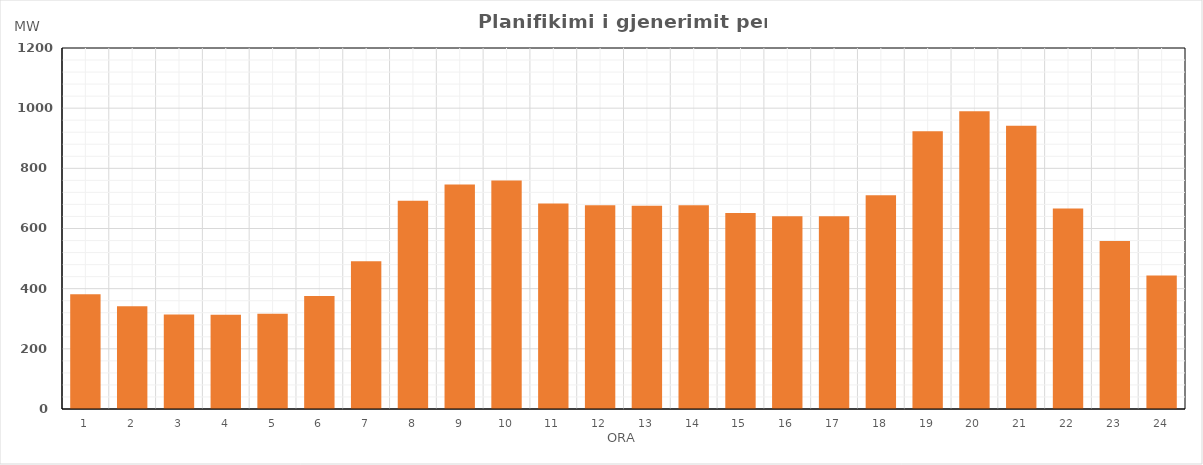
| Category | Max (MW) |
|---|---|
| 0 | 381.745 |
| 1 | 341.4 |
| 2 | 314.4 |
| 3 | 313.4 |
| 4 | 316.4 |
| 5 | 375.4 |
| 6 | 491.318 |
| 7 | 692.4 |
| 8 | 746.4 |
| 9 | 759.446 |
| 10 | 683.186 |
| 11 | 677.4 |
| 12 | 675.4 |
| 13 | 677.4 |
| 14 | 651.4 |
| 15 | 640.4 |
| 16 | 640.4 |
| 17 | 710.4 |
| 18 | 923.547 |
| 19 | 990.096 |
| 20 | 941.814 |
| 21 | 666.272 |
| 22 | 558.711 |
| 23 | 444.129 |